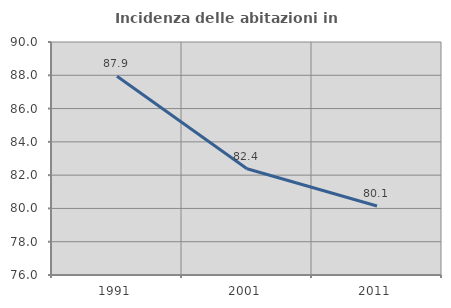
| Category | Incidenza delle abitazioni in proprietà  |
|---|---|
| 1991.0 | 87.946 |
| 2001.0 | 82.382 |
| 2011.0 | 80.147 |